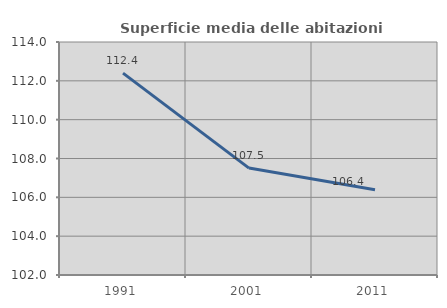
| Category | Superficie media delle abitazioni occupate |
|---|---|
| 1991.0 | 112.399 |
| 2001.0 | 107.507 |
| 2011.0 | 106.39 |